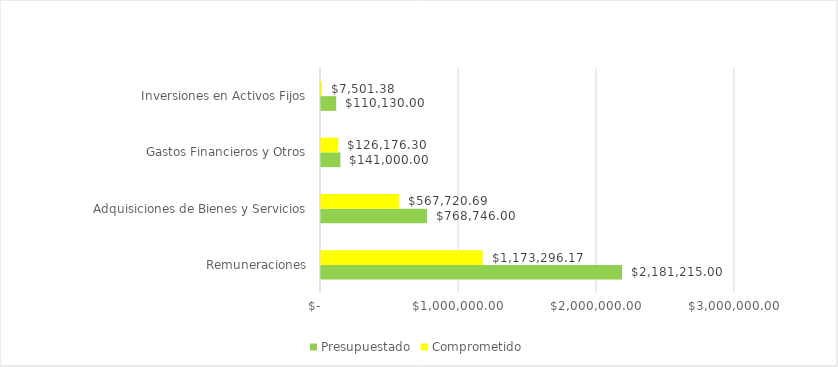
| Category |  Presupuestado  |  Comprometido  |
|---|---|---|
| Remuneraciones | 2181215 | 1173296.17 |
| Adquisiciones de Bienes y Servicios | 768746 | 567720.69 |
| Gastos Financieros y Otros | 141000 | 126176.3 |
| Inversiones en Activos Fijos | 110130 | 7501.38 |